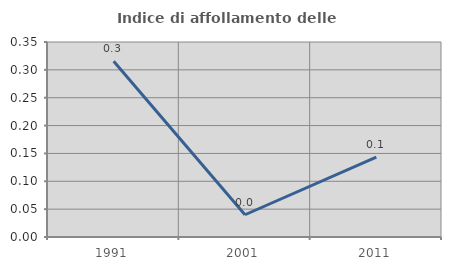
| Category | Indice di affollamento delle abitazioni  |
|---|---|
| 1991.0 | 0.316 |
| 2001.0 | 0.04 |
| 2011.0 | 0.143 |